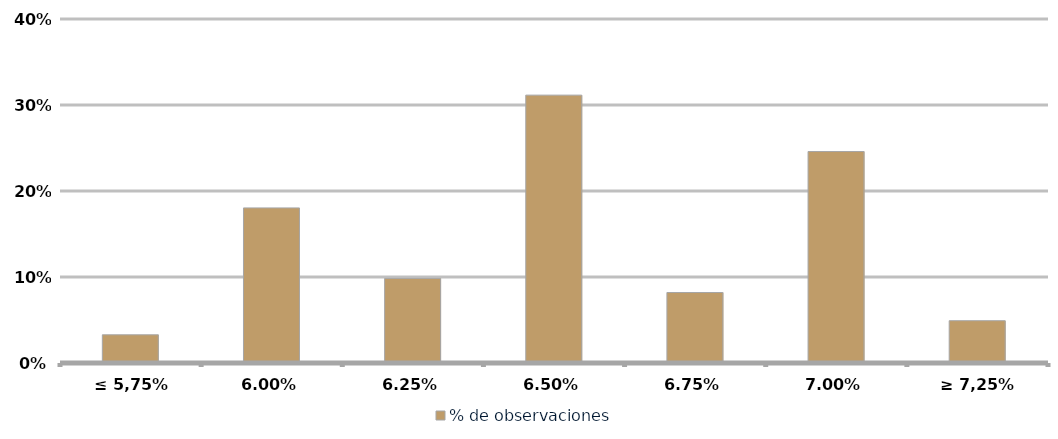
| Category | % de observaciones  |
|---|---|
| ≤ 5,75% | 0.033 |
| 6,00% | 0.18 |
| 6,25% | 0.098 |
| 6,50% | 0.311 |
| 6,75% | 0.082 |
| 7,00% | 0.246 |
| ≥ 7,25% | 0.049 |